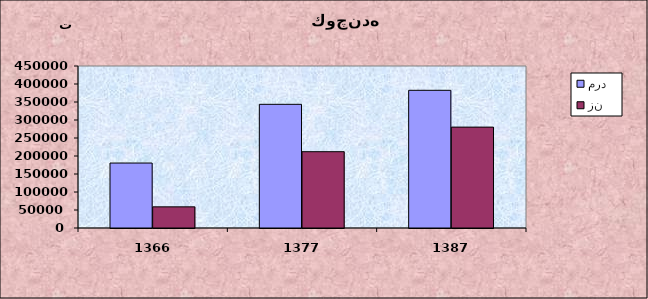
| Category | مرد  | زن |
|---|---|---|
| 1366.0 | 180433 | 58752 |
| 1377.0 | 343546 | 211970 |
| 1387.0 | 382506 | 280230 |